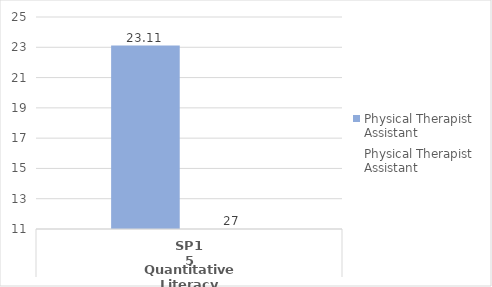
| Category | Average of outcome score - Physical Therapist Assistant | Count of outcome score - Physical Therapist Assistant |
|---|---|---|
| 0 | 23.111 | 27 |